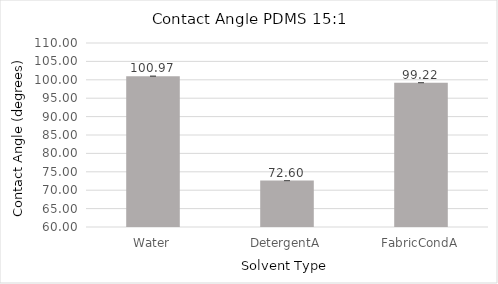
| Category | Series 0 |
|---|---|
| Water | 100.97 |
| DetergentA | 72.603 |
| FabricCondA | 99.223 |